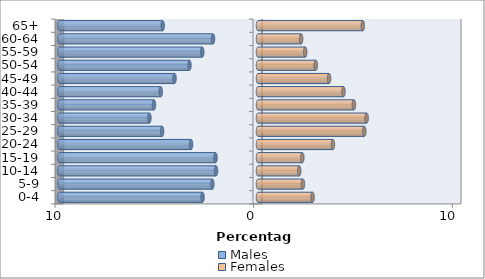
| Category | Males | Females |
|---|---|---|
| 0-4 | -2.793 | 2.748 |
| 5-9 | -2.297 | 2.261 |
| 10-14 | -2.112 | 2.076 |
| 15-19 | -2.137 | 2.23 |
| 20-24 | -3.372 | 3.772 |
| 25-29 | -4.827 | 5.349 |
| 30-34 | -5.466 | 5.469 |
| 35-39 | -5.237 | 4.829 |
| 40-44 | -4.895 | 4.304 |
| 45-49 | -4.201 | 3.579 |
| 50-54 | -3.451 | 2.905 |
| 55-59 | -2.806 | 2.378 |
| 60-64 | -2.263 | 2.169 |
| 65+ | -4.797 | 5.276 |